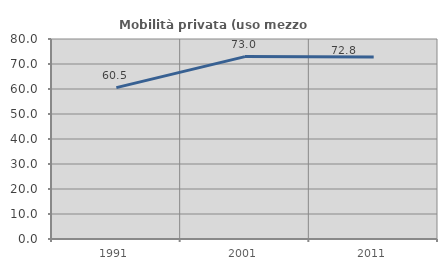
| Category | Mobilità privata (uso mezzo privato) |
|---|---|
| 1991.0 | 60.538 |
| 2001.0 | 72.963 |
| 2011.0 | 72.775 |